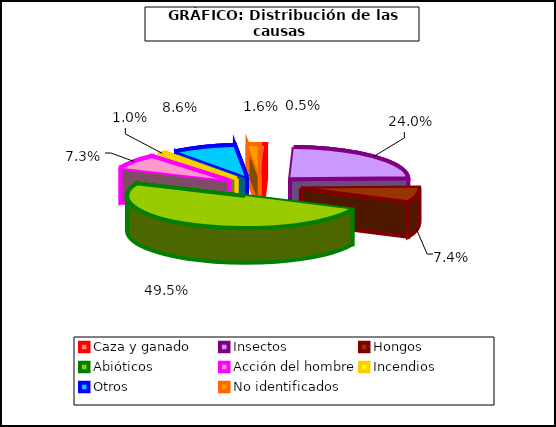
| Category | Series 0 |
|---|---|
| Caza y ganado | 31 |
| Insectos | 1448 |
| Hongos  | 447 |
| Abióticos | 2984 |
| Acción del hombre | 438 |
| Incendios | 63 |
| Otros | 521 |
| No identificados | 98 |